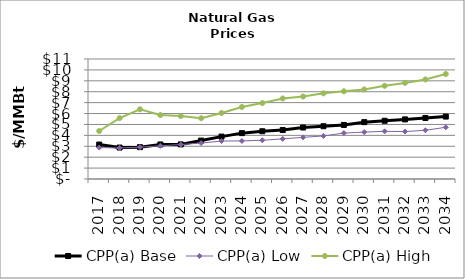
| Category | CPP(a) Base | CPP(a) Low | CPP(a) High |
|---|---|---|---|
| 2017.0 | 3.158 | 2.88 | 4.4 |
| 2018.0 | 2.883 | 2.849 | 5.58 |
| 2019.0 | 2.92 | 2.92 | 6.389 |
| 2020.0 | 3.166 | 3.04 | 5.86 |
| 2021.0 | 3.174 | 3.159 | 5.768 |
| 2022.0 | 3.522 | 3.292 | 5.572 |
| 2023.0 | 3.887 | 3.479 | 6.05 |
| 2024.0 | 4.204 | 3.491 | 6.602 |
| 2025.0 | 4.378 | 3.549 | 6.96 |
| 2026.0 | 4.488 | 3.682 | 7.382 |
| 2027.0 | 4.721 | 3.818 | 7.56 |
| 2028.0 | 4.838 | 3.949 | 7.85 |
| 2029.0 | 4.955 | 4.208 | 8.041 |
| 2030.0 | 5.212 | 4.3 | 8.209 |
| 2031.0 | 5.337 | 4.369 | 8.541 |
| 2032.0 | 5.463 | 4.348 | 8.81 |
| 2033.0 | 5.594 | 4.47 | 9.13 |
| 2034.0 | 5.723 | 4.74 | 9.628 |